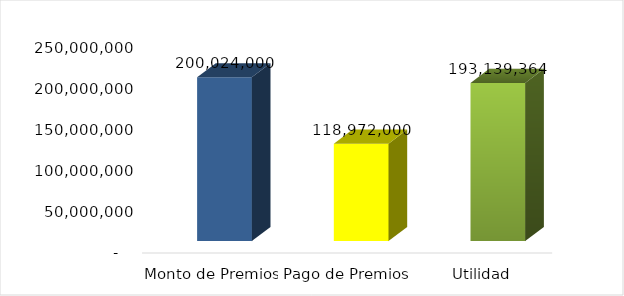
| Category | Series 0 |
|---|---|
| Monto de Premios | 200024000 |
| Pago de Premios | 118972000 |
| Utilidad | 193139364 |